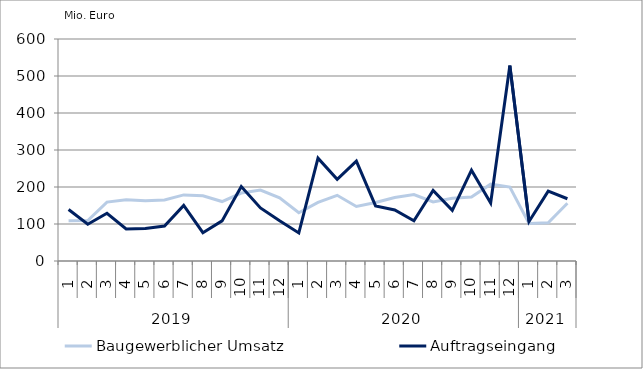
| Category | Baugewerblicher Umsatz | Auftragseingang |
|---|---|---|
| 0 | 108616.605 | 139065.287 |
| 1 | 109331.58 | 99318.609 |
| 2 | 159117.81 | 129002.041 |
| 3 | 165654.287 | 86579.2 |
| 4 | 162976.056 | 87644.362 |
| 5 | 165026.188 | 94463.186 |
| 6 | 178622.938 | 150345.08 |
| 7 | 176074.101 | 76434.317 |
| 8 | 160663.041 | 108444.162 |
| 9 | 183589.485 | 201122.697 |
| 10 | 191777.213 | 143514.792 |
| 11 | 170885.223 | 108780.022 |
| 12 | 130445.562 | 75891.481 |
| 13 | 158433.655 | 277923.85 |
| 14 | 177529.832 | 220973.626 |
| 15 | 147259.799 | 269936.091 |
| 16 | 157965.891 | 149072.895 |
| 17 | 171647.778 | 137984.76 |
| 18 | 179530.732 | 108645.965 |
| 19 | 159480.457 | 190771.468 |
| 20 | 169638.111 | 136988.906 |
| 21 | 173040.053 | 245341.603 |
| 22 | 207619.085 | 156647.224 |
| 23 | 199947.086 | 528166.004 |
| 24 | 101295.895 | 106850.127 |
| 25 | 103236.543 | 188883.434 |
| 26 | 156172.725 | 168204.42 |